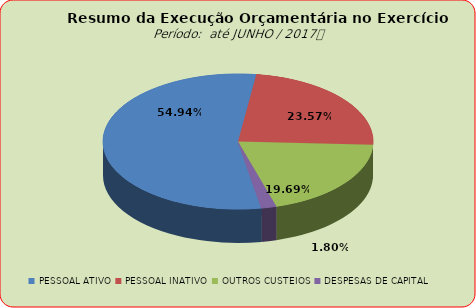
| Category | Series 0 |
|---|---|
| PESSOAL ATIVO | 74064132.13 |
| PESSOAL INATIVO | 31778042.13 |
| OUTROS CUSTEIOS | 26540720.26 |
| DESPESAS DE CAPITAL | 2422776.42 |